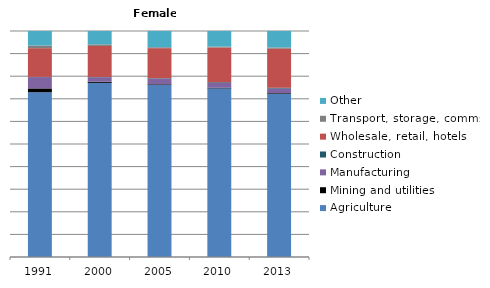
| Category | Agriculture | Mining and utilities | Manufacturing | Construction | Wholesale, retail, hotels | Transport, storage, comms | Other |
|---|---|---|---|---|---|---|---|
| 1991.0 | 72.9 | 1.7 | 5 | 0.1 | 12.7 | 1.2 | 6.4 |
| 2000.0 | 76.9 | 0.5 | 2 | 0.1 | 13.7 | 0.7 | 5.9 |
| 2005.0 | 76.2 | 0.3 | 2.5 | 0.2 | 13.3 | 0.4 | 7.2 |
| 2010.0 | 74.7 | 0.3 | 2.1 | 0.3 | 15.4 | 0.4 | 6.9 |
| 2013.0 | 72.3 | 0.3 | 2 | 0.4 | 17.3 | 0.5 | 7.3 |